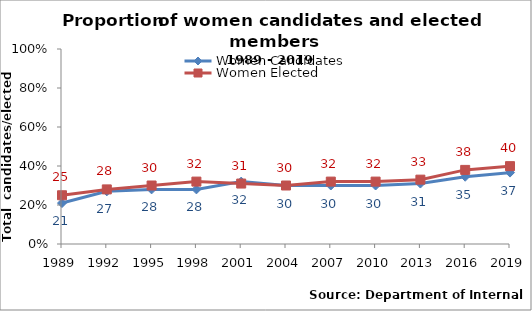
| Category | Women Candidates | Women Elected |
|---|---|---|
| 1989.0 | 0.21 | 0.25 |
| 1992.0 | 0.27 | 0.28 |
| 1995.0 | 0.28 | 0.3 |
| 1998.0 | 0.28 | 0.32 |
| 2001.0 | 0.32 | 0.31 |
| 2004.0 | 0.3 | 0.3 |
| 2007.0 | 0.3 | 0.32 |
| 2010.0 | 0.3 | 0.32 |
| 2013.0 | 0.31 | 0.33 |
| 2016.0 | 0.345 | 0.38 |
| 2019.0 | 0.366 | 0.399 |